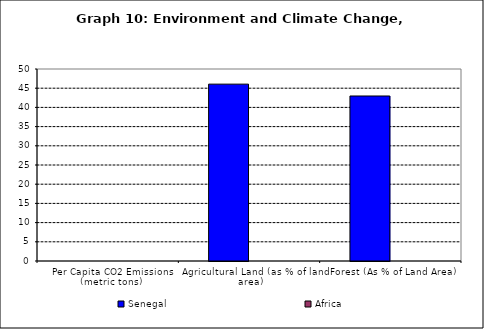
| Category | Senegal | Africa |
|---|---|---|
| Per Capita CO2 Emissions (metric tons) | 0 | 0 |
| Agricultural Land (as % of land area) | 46.06 | 0 |
| Forest (As % of Land Area) | 42.97 | 0 |